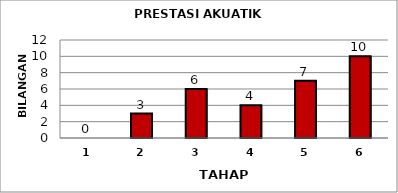
| Category | Series 0 |
|---|---|
| 1.0 | 0 |
| 2.0 | 3 |
| 3.0 | 6 |
| 4.0 | 4 |
| 5.0 | 7 |
| 6.0 | 10 |